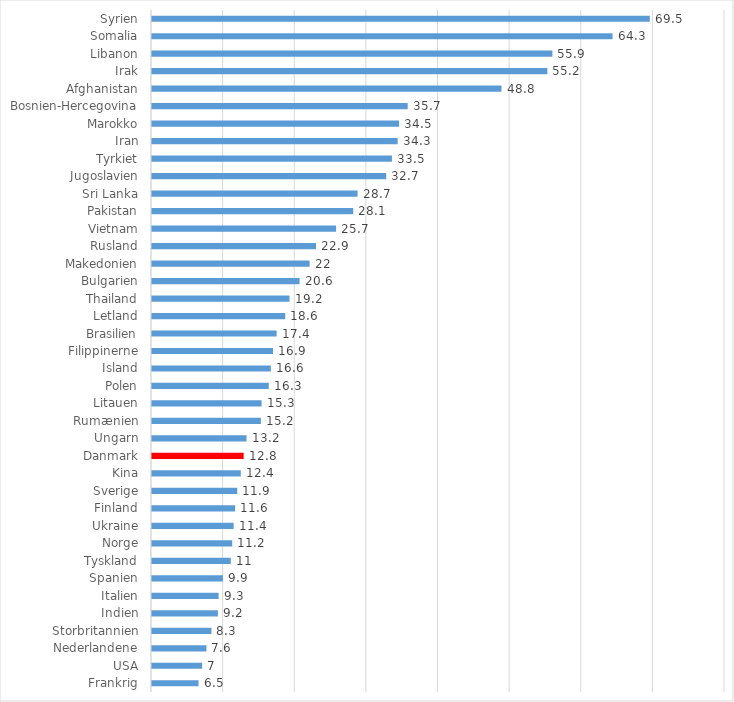
| Category | Series 0 |
|---|---|
| Frankrig | 6.5 |
| USA | 7 |
| Nederlandene | 7.6 |
| Storbritannien | 8.3 |
| Indien | 9.2 |
| Italien | 9.3 |
| Spanien | 9.9 |
| Tyskland | 11 |
| Norge | 11.2 |
| Ukraine | 11.4 |
| Finland | 11.6 |
| Sverige | 11.9 |
| Kina | 12.4 |
| Danmark | 12.8 |
| Ungarn | 13.2 |
| Rumænien | 15.2 |
| Litauen | 15.3 |
| Polen | 16.3 |
| Island | 16.6 |
| Filippinerne | 16.9 |
| Brasilien | 17.4 |
| Letland | 18.6 |
| Thailand | 19.2 |
| Bulgarien | 20.6 |
| Makedonien | 22 |
| Rusland | 22.9 |
| Vietnam | 25.7 |
| Pakistan | 28.1 |
| Sri Lanka | 28.7 |
| Jugoslavien | 32.7 |
| Tyrkiet | 33.5 |
| Iran | 34.3 |
| Marokko | 34.5 |
| Bosnien-Hercegovina | 35.7 |
| Afghanistan | 48.8 |
| Irak | 55.2 |
| Libanon | 55.9 |
| Somalia | 64.3 |
| Syrien | 69.5 |